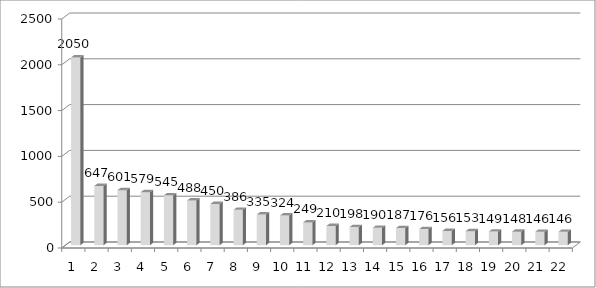
| Category | Series 0 |
|---|---|
| 1.0 | 2050 |
| 2.0 | 647 |
| 3.0 | 601 |
| 4.0 | 579 |
| 5.0 | 545 |
| 6.0 | 488 |
| 7.0 | 450 |
| 8.0 | 386 |
| 9.0 | 335 |
| 10.0 | 324 |
| 11.0 | 249 |
| 12.0 | 210 |
| 13.0 | 198 |
| 14.0 | 190 |
| 15.0 | 187 |
| 16.0 | 176 |
| 17.0 | 156 |
| 18.0 | 153 |
| 19.0 | 149 |
| 20.0 | 148 |
| 21.0 | 146 |
| 22.0 | 146 |